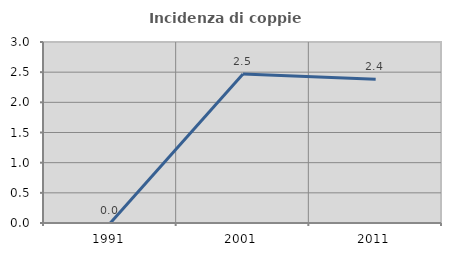
| Category | Incidenza di coppie miste |
|---|---|
| 1991.0 | 0 |
| 2001.0 | 2.469 |
| 2011.0 | 2.381 |